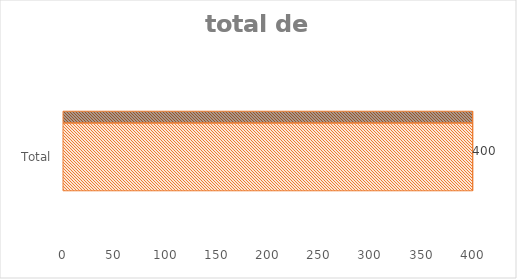
| Category | Total |
|---|---|
| Total | 400 |